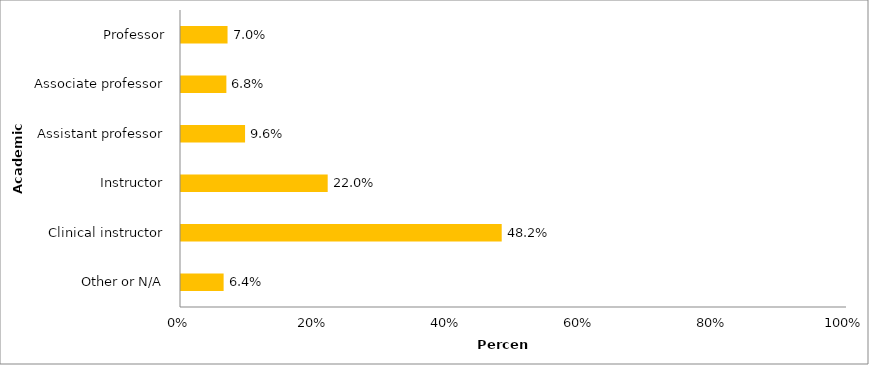
| Category | 2014-15 |
|---|---|
| Other or N/A | 0.064 |
| Clinical instructor | 0.482 |
| Instructor | 0.22 |
| Assistant professor | 0.096 |
| Associate professor | 0.068 |
| Professor | 0.07 |